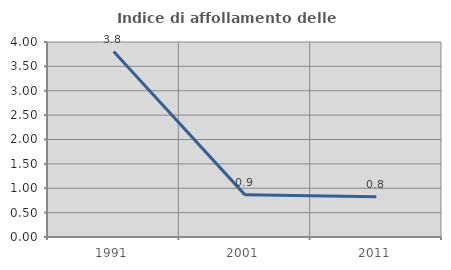
| Category | Indice di affollamento delle abitazioni  |
|---|---|
| 1991.0 | 3.805 |
| 2001.0 | 0.864 |
| 2011.0 | 0.823 |